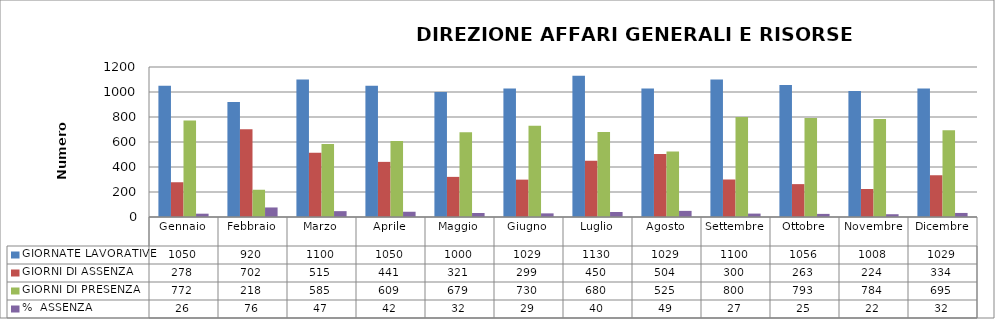
| Category | GIORNATE LAVORATIVE | GIORNI DI ASSENZA | GIORNI DI PRESENZA | %  ASSENZA |
|---|---|---|---|---|
| Gennaio | 1050 | 278 | 772 | 26.476 |
| Febbraio | 920 | 702 | 218 | 76.304 |
| Marzo | 1100 | 515 | 585 | 46.818 |
| Aprile | 1050 | 441 | 609 | 42 |
| Maggio | 1000 | 321 | 679 | 32.1 |
| Giugno | 1029 | 299 | 730 | 29.057 |
| Luglio | 1130 | 450 | 680 | 39.823 |
| Agosto | 1029 | 504 | 525 | 48.98 |
| Settembre | 1100 | 300 | 800 | 27.273 |
| Ottobre | 1056 | 263 | 793 | 24.905 |
| Novembre | 1008 | 224 | 784 | 22.222 |
| Dicembre | 1029 | 334 | 695 | 32.459 |